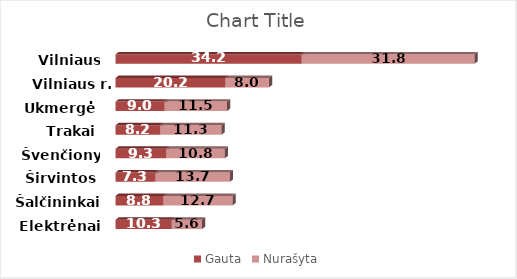
| Category | Gauta | Nurašyta |
|---|---|---|
| Elektrėnai | 10.3 | 5.6 |
| Šalčininkai | 8.8 | 12.7 |
| Širvintos | 7.3 | 13.7 |
| Švenčionys | 9.3 | 10.8 |
| Trakai | 8.2 | 11.3 |
| Ukmergė | 9 | 11.5 |
| Vilniaus r. | 20.2 | 8 |
| Vilniaus m. | 34.2 | 31.8 |